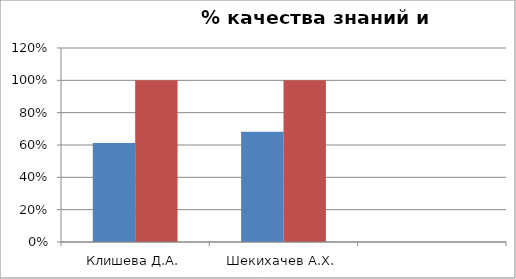
| Category | Series 0 | 2 |
|---|---|---|
| Клишева Д.А. | 0.612 | 1 |
| Шекихачев А.Х. | 0.683 | 1 |